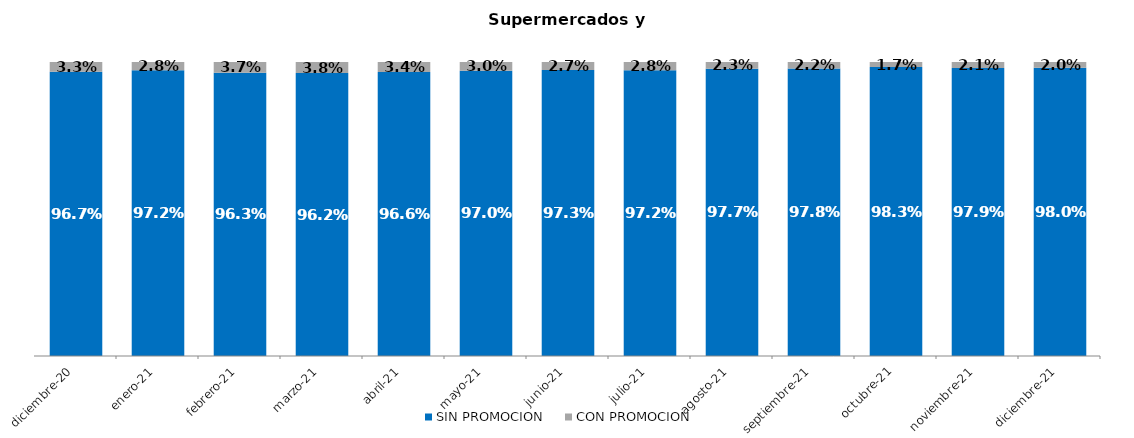
| Category | SIN PROMOCION   | CON PROMOCION   |
|---|---|---|
| 2020-12-01 | 0.967 | 0.033 |
| 2021-01-01 | 0.972 | 0.028 |
| 2021-02-01 | 0.963 | 0.037 |
| 2021-03-01 | 0.962 | 0.038 |
| 2021-04-01 | 0.966 | 0.034 |
| 2021-05-01 | 0.97 | 0.03 |
| 2021-06-01 | 0.973 | 0.027 |
| 2021-07-01 | 0.972 | 0.028 |
| 2021-08-01 | 0.977 | 0.023 |
| 2021-09-01 | 0.978 | 0.022 |
| 2021-10-01 | 0.983 | 0.017 |
| 2021-11-01 | 0.979 | 0.021 |
| 2021-12-01 | 0.98 | 0.02 |